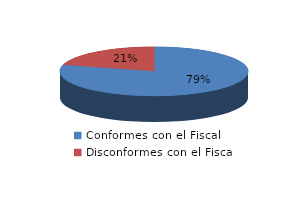
| Category | Series 0 |
|---|---|
| 0 | 111 |
| 1 | 29 |